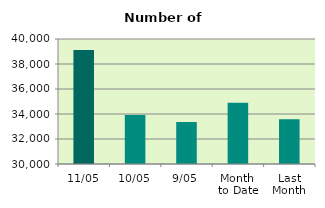
| Category | Series 0 |
|---|---|
| 11/05 | 39122 |
| 10/05 | 33916 |
| 9/05 | 33360 |
| Month 
to Date | 34893 |
| Last
Month | 33588.111 |